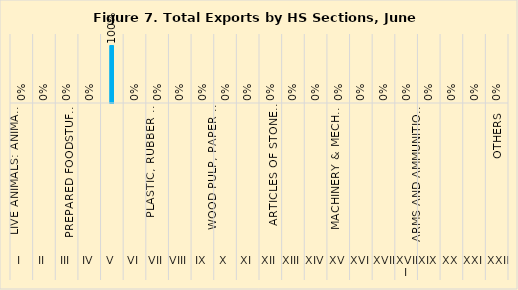
| Category | Jun% |
|---|---|
| 0 | 0 |
| 1 | 0 |
| 2 | 0 |
| 3 | 0 |
| 4 | 1 |
| 5 | 0 |
| 6 | 0 |
| 7 | 0 |
| 8 | 0 |
| 9 | 0 |
| 10 | 0 |
| 11 | 0 |
| 12 | 0 |
| 13 | 0 |
| 14 | 0 |
| 15 | 0 |
| 16 | 0 |
| 17 | 0 |
| 18 | 0 |
| 19 | 0 |
| 20 | 0 |
| 21 | 0 |